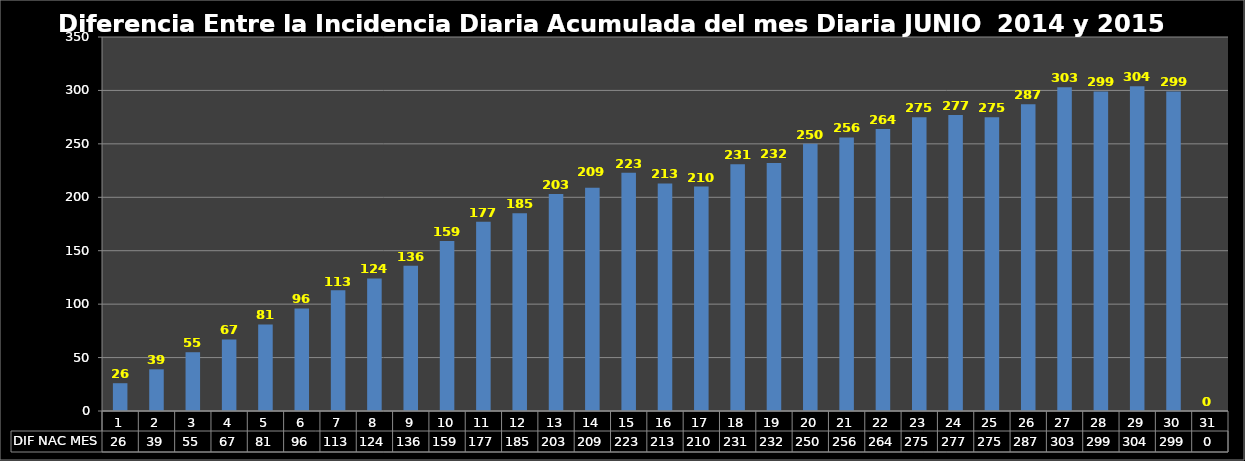
| Category | DIF NAC MES |
|---|---|
| 0 | 26 |
| 1 | 39 |
| 2 | 55 |
| 3 | 67 |
| 4 | 81 |
| 5 | 96 |
| 6 | 113 |
| 7 | 124 |
| 8 | 136 |
| 9 | 159 |
| 10 | 177 |
| 11 | 185 |
| 12 | 203 |
| 13 | 209 |
| 14 | 223 |
| 15 | 213 |
| 16 | 210 |
| 17 | 231 |
| 18 | 232 |
| 19 | 250 |
| 20 | 256 |
| 21 | 264 |
| 22 | 275 |
| 23 | 277 |
| 24 | 275 |
| 25 | 287 |
| 26 | 303 |
| 27 | 299 |
| 28 | 304 |
| 29 | 299 |
| 30 | 0 |